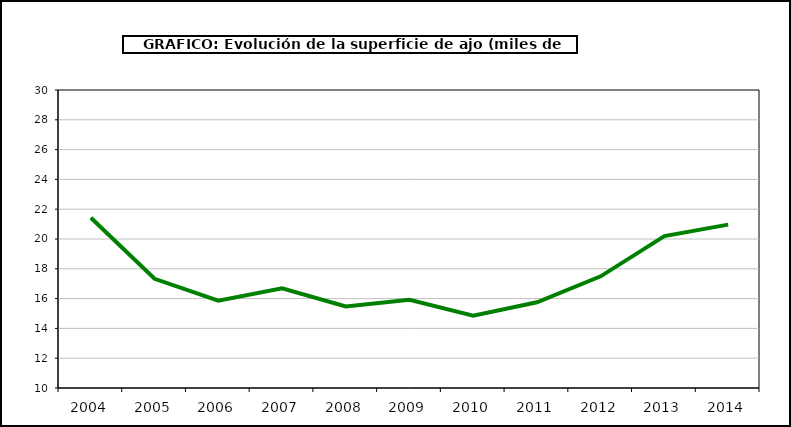
| Category | superficie |
|---|---|
| 2004.0 | 21.428 |
| 2005.0 | 17.331 |
| 2006.0 | 15.86 |
| 2007.0 | 16.686 |
| 2008.0 | 15.473 |
| 2009.0 | 15.919 |
| 2010.0 | 14.85 |
| 2011.0 | 15.75 |
| 2012.0 | 17.494 |
| 2013.0 | 20.197 |
| 2014.0 | 20.965 |